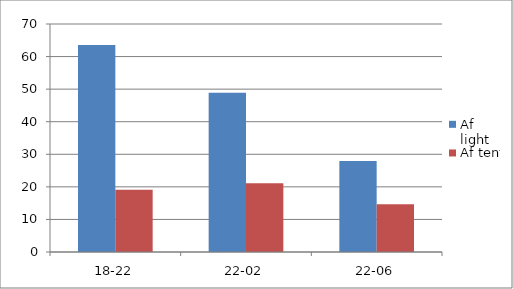
| Category | Af light | Af tent |
|---|---|---|
| 18-22 | 63.544 | 19.115 |
| 22-02 | 48.887 | 21.112 |
| 22-06 | 27.933 | 14.637 |